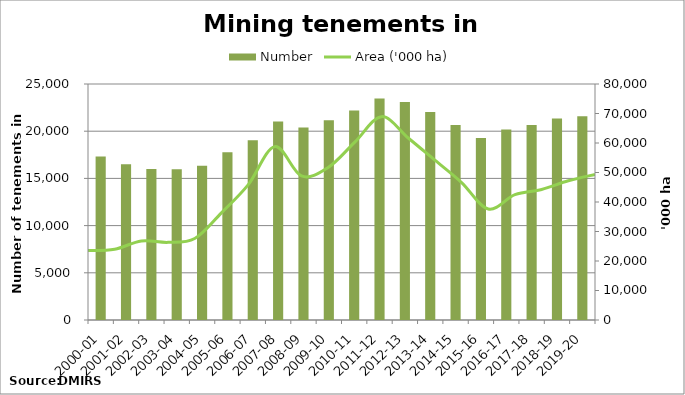
| Category | Number |
|---|---|
| 2000-01 | 17326 |
| 2001-02 | 16487 |
| 2002-03 | 16006 |
| 2003-04 | 15967 |
| 2004-05 | 16347 |
| 2005-06 | 17758 |
| 2006-07 | 19047 |
| 2007-08 | 21026 |
| 2008-09 | 20385 |
| 2009-10 | 21163 |
| 2010-11 | 22182 |
| 2011-12 | 23474 |
| 2012-13 | 23095 |
| 2013-14 | 22041 |
| 2014-15 | 20647 |
| 2015-16 | 19276 |
| 2016-17 | 20185 |
| 2017-18 | 20644 |
| 2018-19 | 21348 |
| 2019-20 | 21574 |